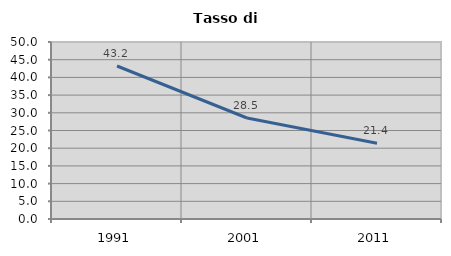
| Category | Tasso di disoccupazione   |
|---|---|
| 1991.0 | 43.223 |
| 2001.0 | 28.527 |
| 2011.0 | 21.386 |